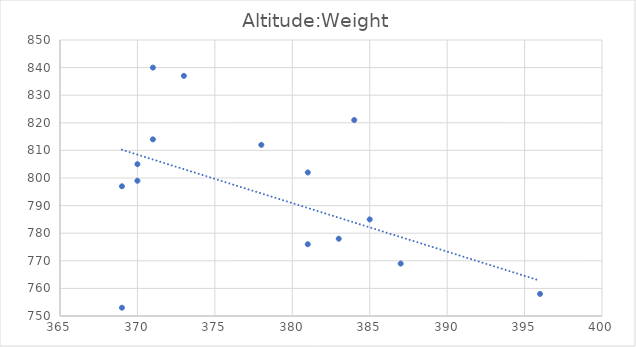
| Category | Altitude:Weight |
|---|---|
| 384.0 | 821 |
| 396.0 | 758 |
| 378.0 | 812 |
| 385.0 | 785 |
| 383.0 | 778 |
| 369.0 | 797 |
| 370.0 | 799 |
| 370.0 | 805 |
| 373.0 | 837 |
| 381.0 | 802 |
| 381.0 | 776 |
| 369.0 | 753 |
| 371.0 | 840 |
| 387.0 | 769 |
| 390.0 | 747 |
| 371.0 | 814 |